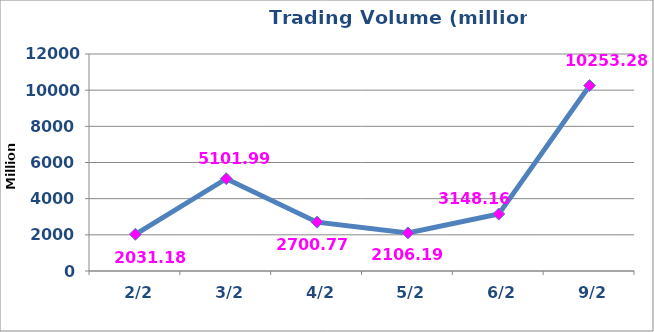
| Category | القيمة المتداولة |
|---|---|
|  2/2 | 2031186130 |
|  3/2 | 5101996408 |
|  4/2 | 2700771891 |
|  5/2 | 2106194610 |
|  6/2 | 3148161129 |
|  9/2 | 10253287117 |